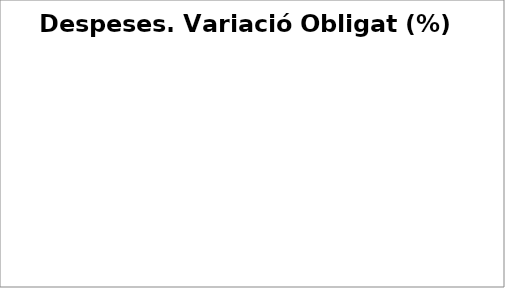
| Category | Series 0 |
|---|---|
| Despeses de personal | 0.007 |
| Despeses en béns corrents i serveis | 0.033 |
| Despeses financeres | -0.1 |
| Transferències corrents | 0.056 |
| Fons de contingència | 0 |
| Inversions reals | 0.248 |
| Transferències de capital | -0.1 |
| Actius financers | 0.096 |
| Passius financers | 0.263 |